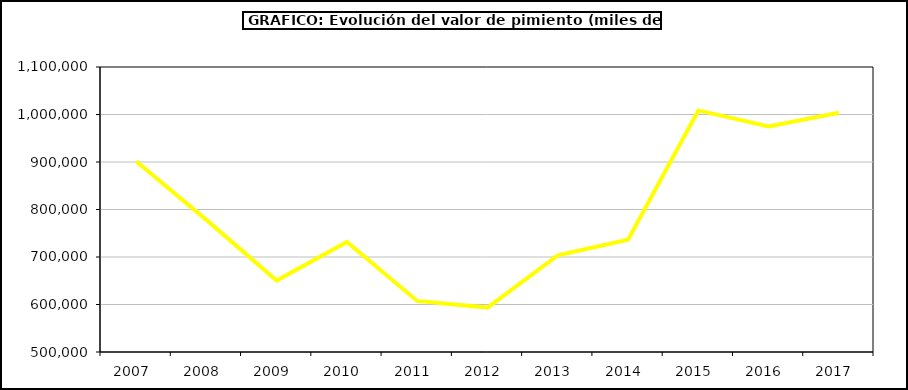
| Category | Valor |
|---|---|
| 2007.0 | 901441.129 |
| 2008.0 | 778215.464 |
| 2009.0 | 650428.968 |
| 2010.0 | 731583.218 |
| 2011.0 | 607528.309 |
| 2012.0 | 593530.063 |
| 2013.0 | 703328.169 |
| 2014.0 | 736417.986 |
| 2015.0 | 1008587 |
| 2016.0 | 974815 |
| 2017.0 | 1003610.326 |